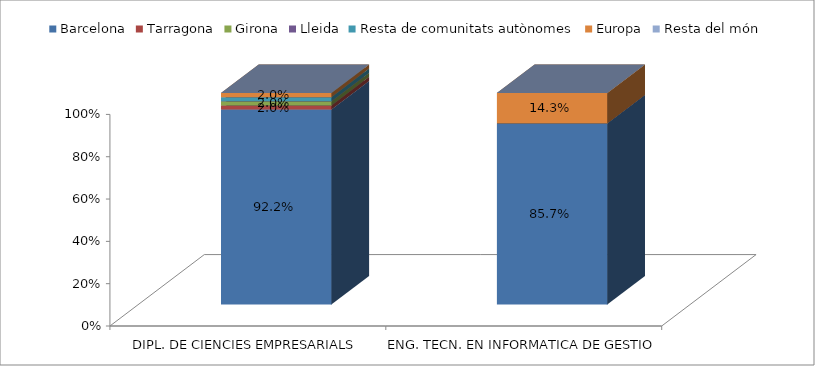
| Category | Barcelona | Tarragona | Girona | Lleida | Resta de comunitats autònomes | Europa | Resta del món |
|---|---|---|---|---|---|---|---|
| DIPL. DE CIENCIES EMPRESARIALS | 0.922 | 0.02 | 0.02 | 0 | 0.02 | 0.02 | 0 |
| ENG. TECN. EN INFORMATICA DE GESTIO | 0.857 | 0 | 0 | 0 | 0 | 0.143 | 0 |